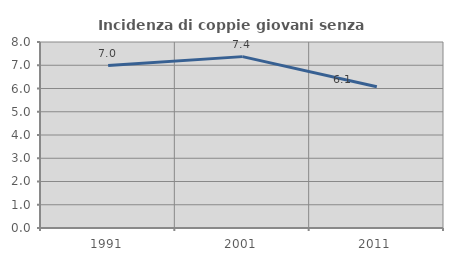
| Category | Incidenza di coppie giovani senza figli |
|---|---|
| 1991.0 | 6.985 |
| 2001.0 | 7.371 |
| 2011.0 | 6.073 |